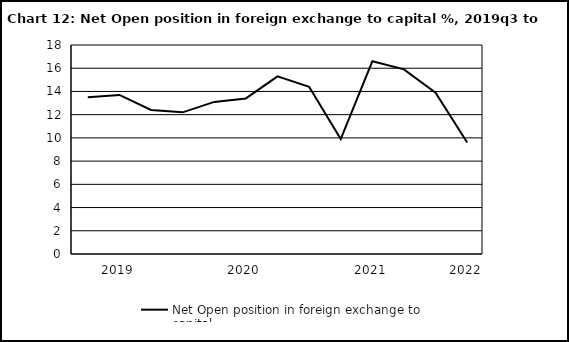
| Category | Net Open position in foreign exchange to capital |
|---|---|
| nan | 13.5 |
| 2019.0 | 13.7 |
| nan | 12.4 |
| nan | 12.2 |
| nan | 13.1 |
| 2020.0 | 13.4 |
| nan | 15.3 |
| nan | 14.4 |
| nan | 9.9 |
| 2021.0 | 16.6 |
| nan | 15.9 |
| nan | 13.9 |
| 2022.0 | 9.6 |